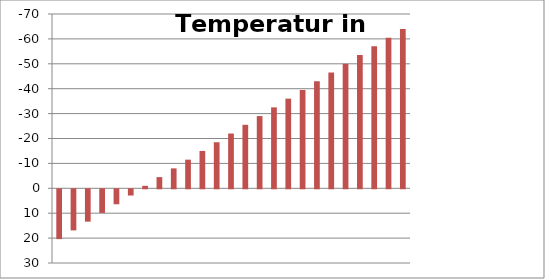
| Category | Temperatur in °C |
|---|---|
| 0 | 20 |
| 1 | 16.5 |
| 2 | 13 |
| 3 | 9.5 |
| 4 | 6 |
| 5 | 2.5 |
| 6 | -1 |
| 7 | -4.5 |
| 8 | -8 |
| 9 | -11.5 |
| 10 | -15 |
| 11 | -18.5 |
| 12 | -22 |
| 13 | -25.5 |
| 14 | -29 |
| 15 | -32.5 |
| 16 | -36 |
| 17 | -39.5 |
| 18 | -43 |
| 19 | -46.5 |
| 20 | -50 |
| 21 | -53.5 |
| 22 | -57 |
| 23 | -60.5 |
| 24 | -64 |